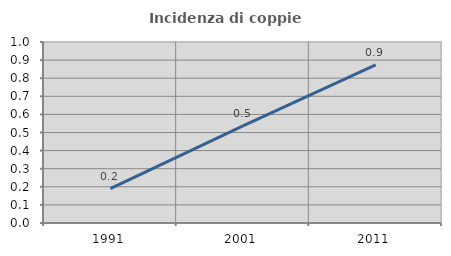
| Category | Incidenza di coppie miste |
|---|---|
| 1991.0 | 0.189 |
| 2001.0 | 0.537 |
| 2011.0 | 0.874 |